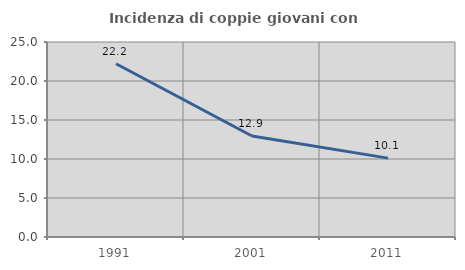
| Category | Incidenza di coppie giovani con figli |
|---|---|
| 1991.0 | 22.216 |
| 2001.0 | 12.945 |
| 2011.0 | 10.113 |